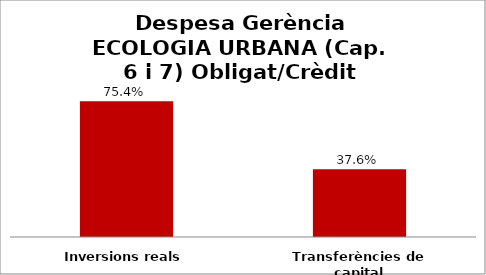
| Category | Series 0 |
|---|---|
| Inversions reals | 0.754 |
| Transferències de capital | 0.376 |